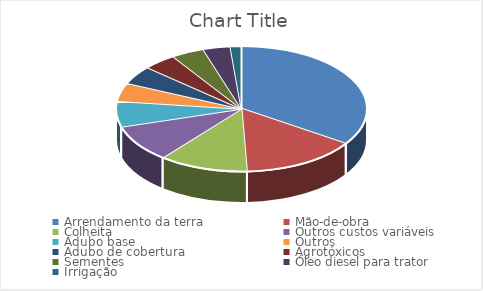
| Category | Series 0 |
|---|---|
| Arrendamento da terra | 34.421 |
| Mão-de-obra  | 14.897 |
| Colheita | 11.474 |
| Outros custos variáveis | 9.583 |
| Adubo base | 6.575 |
| Outros | 4.788 |
| Adubo de cobertura | 4.726 |
| Agrotóxicos | 4.332 |
| Sementes | 4.253 |
| Óleo diesel para trator  | 3.535 |
| Irrigação | 1.417 |